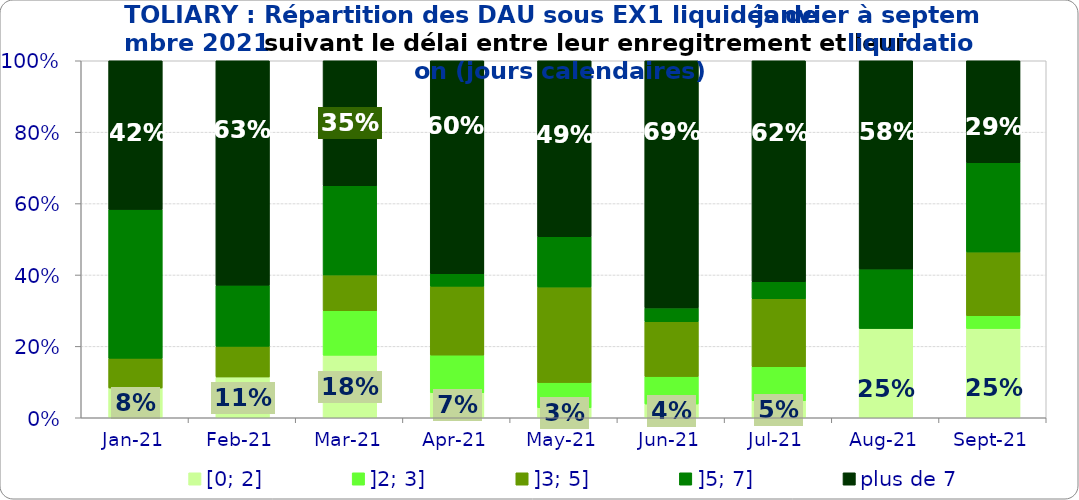
| Category | [0; 2] | ]2; 3] | ]3; 5] | ]5; 7] | plus de 7 |
|---|---|---|---|---|---|
| 2021-01-01 | 0.083 | 0 | 0.083 | 0.417 | 0.417 |
| 2021-02-01 | 0.114 | 0 | 0.086 | 0.171 | 0.629 |
| 2021-03-01 | 0.175 | 0.125 | 0.1 | 0.25 | 0.35 |
| 2021-04-01 | 0.07 | 0.105 | 0.193 | 0.035 | 0.596 |
| 2021-05-01 | 0.028 | 0.07 | 0.268 | 0.141 | 0.493 |
| 2021-06-01 | 0.038 | 0.077 | 0.154 | 0.038 | 0.692 |
| 2021-07-01 | 0.048 | 0.095 | 0.19 | 0.048 | 0.619 |
| 2021-08-01 | 0.25 | 0 | 0 | 0.167 | 0.583 |
| 2021-09-01 | 0.25 | 0.036 | 0.179 | 0.25 | 0.286 |